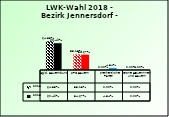
| Category | 2013 | 2018 |
|---|---|---|
| Bgld. Bauernbund | 0.648 | 0.605 |
| SPÖ Bauern | 0.352 | 0.347 |
| Freiheitliche Partei | 0 | 0.048 |
| Grüne Bäuerinnen und Bauern | 0 | 0 |